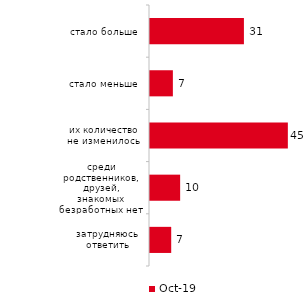
| Category | окт.19 |
|---|---|
| стало больше | 30.693 |
| стало меньше | 7.475 |
| их количество не изменилось | 45.05 |
| среди родственников, друзей, знакомых безработных нет | 9.851 |
| затрудняюсь ответить | 6.931 |